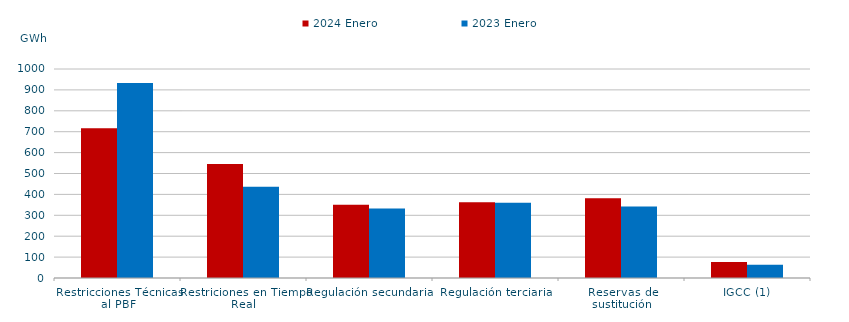
| Category | 2024 Enero | 2023 Enero |
|---|---|---|
| Restricciones Técnicas al PBF | 716.448 | 933.346 |
| Restriciones en Tiempo Real | 545.771 | 436.885 |
| Regulación secundaria | 350.554 | 332.701 |
| Regulación terciaria | 362.128 | 359.927 |
| Reservas de sustitución | 381.271 | 341.675 |
| IGCC (1) | 76.52 | 63.422 |